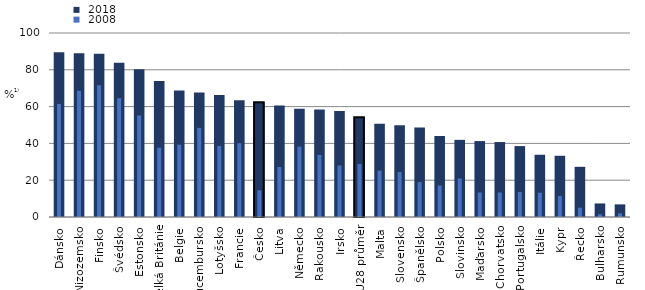
| Category |  2018 |
|---|---|
| Dánsko | 89.473 |
| Nizozemsko | 88.94 |
| Finsko | 88.713 |
| Švédsko | 83.859 |
| Estonsko | 80.357 |
| Velká Británie | 73.882 |
| Belgie | 68.742 |
| Lucembursko | 67.668 |
| Lotyšsko | 66.334 |
| Francie | 63.481 |
| Česko | 62.421 |
| Litva | 60.621 |
| Německo | 58.837 |
| Rakousko | 58.408 |
| Irsko | 57.668 |
| EU28 průměr | 54.277 |
| Malta | 50.713 |
| Slovensko | 49.804 |
| Španělsko | 48.661 |
| Polsko | 44.011 |
| Slovinsko | 41.924 |
| Maďarsko | 41.27 |
| Chorvatsko | 40.74 |
| Portugalsko | 38.549 |
| Itálie | 33.834 |
| Kypr | 33.281 |
| Řecko | 27.278 |
| Bulharsko | 7.37 |
| Rumunsko | 6.866 |